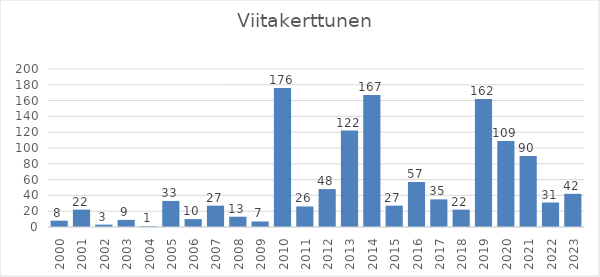
| Category | Series 0 |
|---|---|
| 2000.0 | 8 |
| 2001.0 | 22 |
| 2002.0 | 3 |
| 2003.0 | 9 |
| 2004.0 | 1 |
| 2005.0 | 33 |
| 2006.0 | 10 |
| 2007.0 | 27 |
| 2008.0 | 13 |
| 2009.0 | 7 |
| 2010.0 | 176 |
| 2011.0 | 26 |
| 2012.0 | 48 |
| 2013.0 | 122 |
| 2014.0 | 167 |
| 2015.0 | 27 |
| 2016.0 | 57 |
| 2017.0 | 35 |
| 2018.0 | 22 |
| 2019.0 | 162 |
| 2020.0 | 109 |
| 2021.0 | 90 |
| 2022.0 | 31 |
| 2023.0 | 42 |